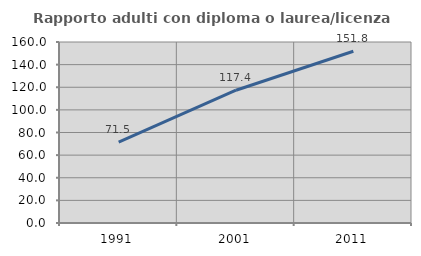
| Category | Rapporto adulti con diploma o laurea/licenza media  |
|---|---|
| 1991.0 | 71.469 |
| 2001.0 | 117.361 |
| 2011.0 | 151.843 |